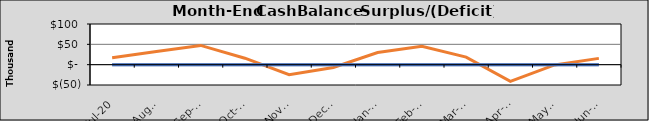
| Category | Final Cash | Original Cash | Revised Cash |
|---|---|---|---|
| 2020-07-01 | 17012.887 | 0 | 0 |
| 2020-08-01 | 32352.719 | 0 | 0 |
| 2020-09-01 | 47302.551 | 0 | 0 |
| 2020-10-02 | 15921.258 | 0 | 0 |
| 2020-11-02 | -24665.856 | 0 | 0 |
| 2020-12-03 | -6812.969 | 0 | 0 |
| 2021-01-03 | 29839.043 | 0 | 0 |
| 2021-02-03 | 45148.875 | 0 | 0 |
| 2021-03-06 | 18499.402 | 0 | 0 |
| 2021-04-06 | -41212.711 | 0 | 0 |
| 2021-05-07 | -699.824 | 0 | 0 |
| 2021-06-07 | 15452.188 | 0 | 0 |